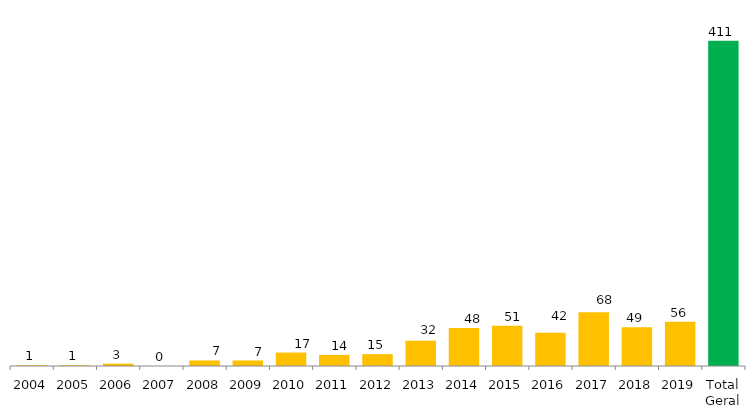
| Category | Categoria/Ano |
|---|---|
| 2004 | 1 |
| 2005 | 1 |
| 2006 | 3 |
| 2007 | 0 |
| 2008 | 7 |
| 2009 | 7 |
| 2010 | 17 |
| 2011 | 14 |
| 2012 | 15 |
| 2013 | 32 |
| 2014 | 48 |
| 2015 | 51 |
| 2016 | 42 |
| 2017 | 68 |
| 2018 | 49 |
| 2019 | 56 |
| Total Geral | 411 |